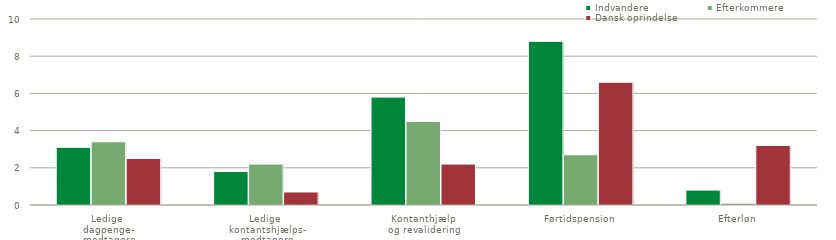
| Category | Indvandere | Efterkommere | Dansk oprindelse |
|---|---|---|---|
| Ledige 
dagpenge-
modtagere | 3.1 | 3.4 | 2.5 |
| Ledige 
kontantshjælps-
modtagere | 1.8 | 2.2 | 0.7 |
| Kontanthjælp 
og revalidering | 5.8 | 4.5 | 2.2 |
| Førtidspension | 8.8 | 2.7 | 6.6 |
| Efterløn | 0.8 | 0.1 | 3.2 |